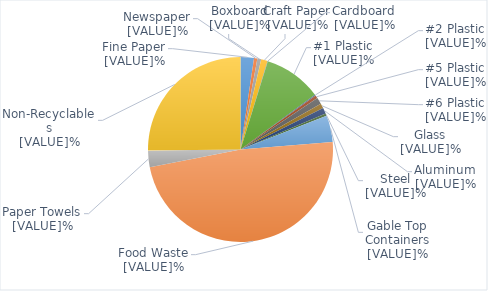
| Category | Series 0 |
|---|---|
| 0 | 2.344 |
| 1 | 0.586 |
| 2 | 0.67 |
| 3 | 1.13 |
| 4 | 0.042 |
| 5 | 10.13 |
| 6 | 0.167 |
| 7 | 0.544 |
| 8 | 1.13 |
| 9 | 0.837 |
| 10 | 1.046 |
| 11 | 0.419 |
| 12 | 4.646 |
| 13 | 48.221 |
| 14 | 2.93 |
| 15 | 25.157 |